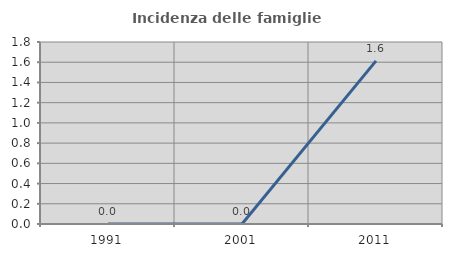
| Category | Incidenza delle famiglie numerose |
|---|---|
| 1991.0 | 0 |
| 2001.0 | 0 |
| 2011.0 | 1.613 |